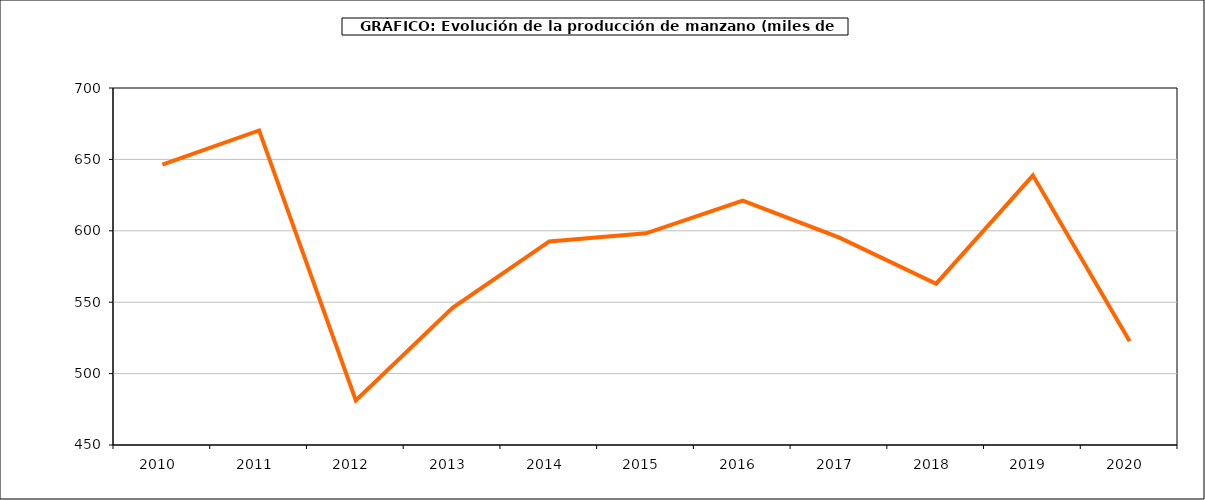
| Category | producción manzano |
|---|---|
| 2010.0 | 646.264 |
| 2011.0 | 670.284 |
| 2012.0 | 481.223 |
| 2013.0 | 545.992 |
| 2014.0 | 592.576 |
| 2015.0 | 598.207 |
| 2016.0 | 621.164 |
| 2017.0 | 595.202 |
| 2018.0 | 562.961 |
| 2019.0 | 638.839 |
| 2020.0 | 522.618 |